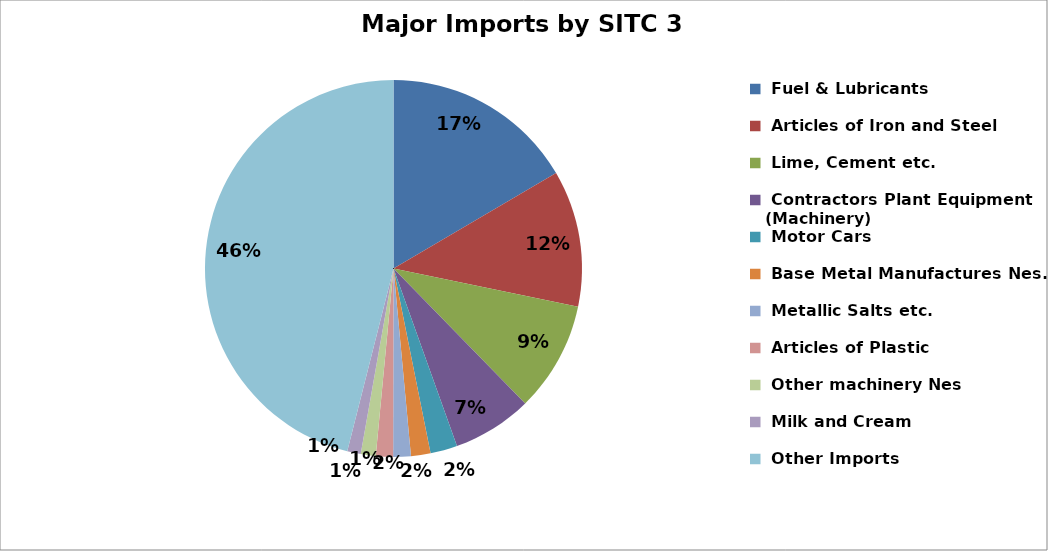
| Category | Series 0 |
|---|---|
| Fuel & Lubricants | 181269.419 |
| Articles of Iron and Steel | 128140.988 |
| Lime, Cement etc. | 103263.946 |
| Contractors Plant Equipment (Machinery) | 74945.189 |
| Motor Cars | 25339.231 |
| Base Metal Manufactures Nes. | 18312.936 |
| Metallic Salts etc. | 16498.846 |
| Articles of Plastic | 16140.419 |
| Other machinery Nes | 14035.606 |
| Milk and Cream | 12708.222 |
| Other Imports | 504240.427 |